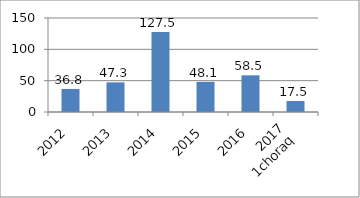
| Category | Series 0 |
|---|---|
| 2012 | 36.8 |
| 2013 | 47.3 |
| 2014 | 127.5 |
| 2015 | 48.1 |
| 2016 | 58.5 |
| 2017
1choraq | 17.5 |